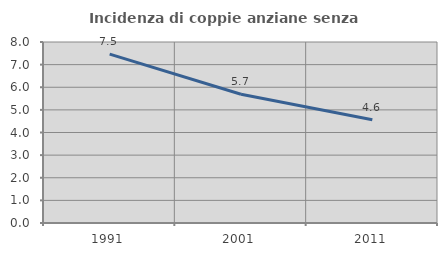
| Category | Incidenza di coppie anziane senza figli  |
|---|---|
| 1991.0 | 7.463 |
| 2001.0 | 5.689 |
| 2011.0 | 4.56 |